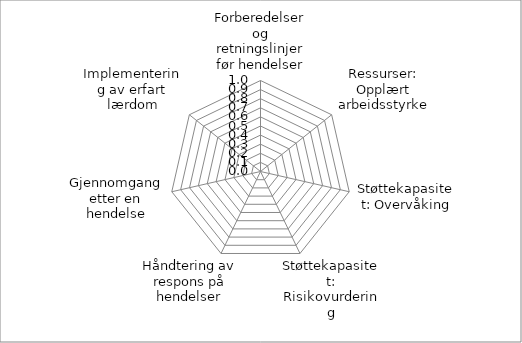
| Category | Series 0 |
|---|---|
| Forberedelser og retningslinjer før hendelser | 0 |
| Ressurser: Opplært arbeidsstyrke | 0 |
| Støttekapasitet: Overvåking | 0 |
| Støttekapasitet: Risikovurdering | 0 |
| Håndtering av respons på hendelser | 0 |
| Gjennomgang etter en hendelse | 0 |
| Implementering av erfart lærdom | 0 |